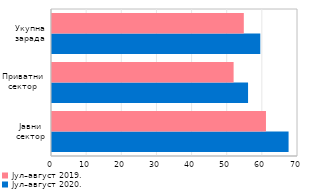
| Category | Јул–август 2020. | Јул–август 2019. |
|---|---|---|
| Јавни сектор | 67.318 | 60.884 |
| Приватни сектор | 55.79 | 51.678 |
| Укупна зарада | 59.271 | 54.579 |